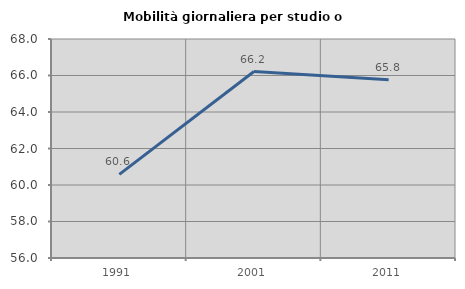
| Category | Mobilità giornaliera per studio o lavoro |
|---|---|
| 1991.0 | 60.585 |
| 2001.0 | 66.216 |
| 2011.0 | 65.768 |